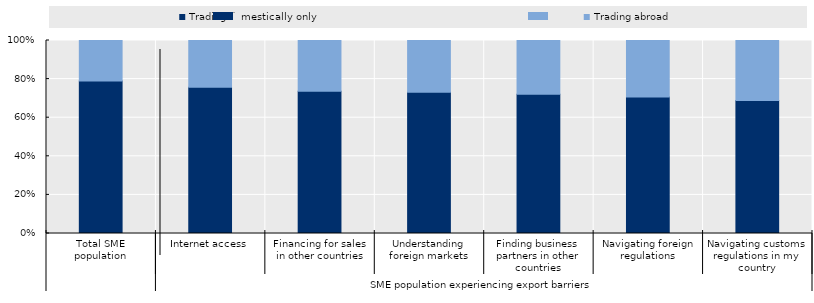
| Category | Trading domestically only | Trading abroad |
|---|---|---|
| 0 | 0.79 | 0.21 |
| 1 | 0.758 | 0.242 |
| 2 | 0.736 | 0.264 |
| 3 | 0.731 | 0.269 |
| 4 | 0.721 | 0.279 |
| 5 | 0.708 | 0.292 |
| 6 | 0.689 | 0.311 |